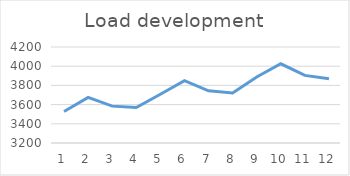
| Category | Series 0 |
|---|---|
| 0 | 3528 |
| 1 | 3675 |
| 2 | 3584 |
| 3 | 3570 |
| 4 | 3708 |
| 5 | 3850 |
| 6 | 3744 |
| 7 | 3720 |
| 8 | 3888 |
| 9 | 4025 |
| 10 | 3904 |
| 11 | 3870 |